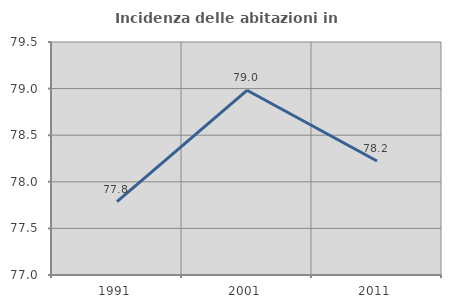
| Category | Incidenza delle abitazioni in proprietà  |
|---|---|
| 1991.0 | 77.787 |
| 2001.0 | 78.982 |
| 2011.0 | 78.223 |